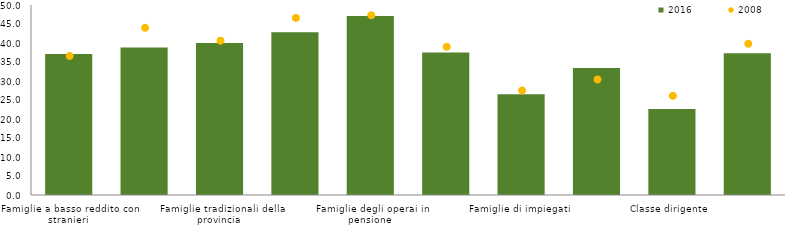
| Category | 2016 |
|---|---|
| Famiglie a basso reddito con stranieri  | 37.1 |
| Famiglie a basso reddito di soli italiani  | 38.8 |
| Famiglie tradizionali della provincia  | 40 |
| Anziane sole e giovani disoccupati  | 42.8 |
| Famiglie degli operai in pensione  | 47.1 |
| Giovani blue-collar  | 37.5 |
| Famiglie di impiegati  | 26.5 |
| Pensioni d’argento  | 33.4 |
| Classe dirigente  | 22.6 |
| Totale | 37.3 |